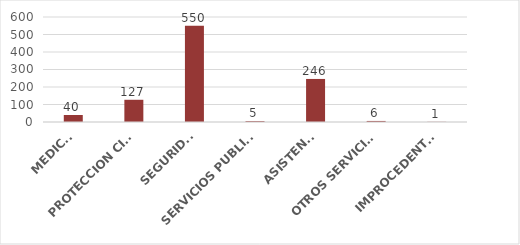
| Category | TOTAL |
|---|---|
| MEDICO | 40 |
| PROTECCION CIVIL | 127 |
| SEGURIDAD | 550 |
| SERVICIOS PUBLICOS | 5 |
| ASISTENCIA | 246 |
| OTROS SERVICIOS | 6 |
| IMPROCEDENTES | 1 |